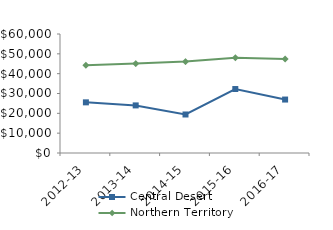
| Category | Central Desert | Northern Territory |
|---|---|---|
| 2012-13 | 25538.62 | 44232.02 |
| 2013-14 | 23996.45 | 45075.51 |
| 2014-15 | 19419.52 | 46083.65 |
| 2015-16 | 32255 | 48046.27 |
| 2016-17 | 26949.76 | 47367.05 |